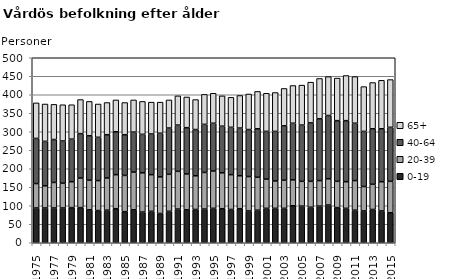
| Category | 0-19 | 20-39 | 40-64 | 65+ |
|---|---|---|---|---|
| 1975.0 | 94 | 66 | 122 | 96 |
| 1976.0 | 94 | 60 | 120 | 101 |
| 1977.0 | 94 | 69 | 116 | 95 |
| 1978.0 | 94 | 67 | 114 | 98 |
| 1979.0 | 95 | 70 | 115 | 93 |
| 1980.0 | 95 | 80 | 120 | 92 |
| 1981.0 | 89 | 80 | 120 | 93 |
| 1982.0 | 87 | 81 | 117 | 90 |
| 1983.0 | 88 | 87 | 117 | 87 |
| 1984.0 | 92 | 92 | 116 | 86 |
| 1985.0 | 84 | 98 | 110 | 87 |
| 1986.0 | 89 | 102 | 108 | 87 |
| 1987.0 | 83 | 106 | 104 | 89 |
| 1988.0 | 85 | 99 | 110 | 86 |
| 1989.0 | 79 | 99 | 118 | 84 |
| 1990.0 | 85 | 100 | 125 | 76 |
| 1991.0 | 91 | 102 | 125 | 79 |
| 1992.0 | 89 | 97 | 125 | 83 |
| 1993.0 | 90 | 91 | 125 | 81 |
| 1994.0 | 91 | 99 | 130 | 81 |
| 1995.0 | 93 | 101 | 129 | 81 |
| 1996.0 | 92 | 97 | 126 | 82 |
| 1997.0 | 90 | 94 | 128 | 81 |
| 1998.0 | 92 | 89 | 129 | 88 |
| 1999.0 | 86 | 93 | 127 | 96 |
| 2000.0 | 88 | 89 | 131 | 101 |
| 2001.0 | 93 | 79 | 129 | 103 |
| 2002.0 | 93 | 74 | 134 | 105 |
| 2003.0 | 93 | 76 | 147 | 101 |
| 2004.0 | 100 | 70 | 153 | 102 |
| 2005.0 | 99 | 67 | 152 | 108 |
| 2006.0 | 96 | 70 | 158 | 110 |
| 2007.0 | 99 | 69 | 167 | 109 |
| 2008.0 | 102 | 71 | 171 | 105 |
| 2009.0 | 95 | 71 | 164 | 115 |
| 2010.0 | 93 | 72 | 165 | 122 |
| 2011.0 | 88 | 80 | 155 | 126 |
| 2012.0 | 86 | 66 | 149 | 121 |
| 2013.0 | 90 | 68 | 150 | 125 |
| 2014.0 | 86 | 79 | 143 | 131 |
| 2015.0 | 81 | 85 | 146 | 129 |